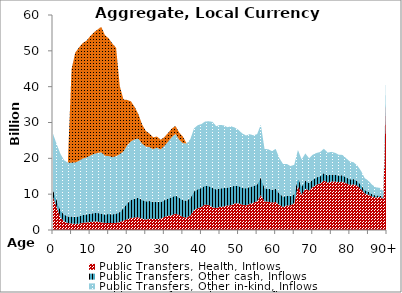
| Category | Public Transfers, Health, Inflows | Public Transfers, Other cash, Inflows | Public Transfers, Other in-kind, Inflows | Public Transfers, Education, Inflows |
|---|---|---|---|---|
| 0 | 9147.146 | 1959.565 | 15764.592 | 0 |
|  | 6385.825 | 1941.535 | 15600.686 | 0 |
| 2 | 3504.201 | 1968.343 | 15796.994 | 0 |
| 3 | 2394.184 | 1897.292 | 15178.629 | 0 |
| 4 | 1921.406 | 1890.214 | 14998.769 | 0 |
| 5 | 1818.423 | 1922.738 | 15039.878 | 26108.986 |
| 6 | 1701.352 | 1977.274 | 15147.878 | 30673.679 |
| 7 | 1760.908 | 2069.683 | 15477.897 | 31628.158 |
| 8 | 2030.554 | 2155.576 | 15734.792 | 32236.941 |
| 9 | 2133.294 | 2226.036 | 15872.092 | 32582.905 |
| 10 | 2224.043 | 2312.11 | 16204.069 | 33305.029 |
| 11 | 2357.462 | 2367.471 | 16484.465 | 33922.675 |
| 12 | 2337.153 | 2408.302 | 16750.487 | 34438.612 |
| 13 | 2152.805 | 2446.356 | 17051.362 | 35030.481 |
| 14 | 1992.421 | 2318.454 | 16406.231 | 33653.698 |
| 15 | 1961.53 | 2527.52 | 16142.325 | 32859.396 |
| 16 | 1917.819 | 2440.296 | 15956.04 | 31710.072 |
| 17 | 2018.392 | 2556.961 | 16032.409 | 30269.003 |
| 18 | 2214.767 | 2802.642 | 16125.905 | 18957.695 |
| 19 | 2621.151 | 3487.059 | 15856.642 | 14451.734 |
| 20 | 3004.753 | 4463.872 | 16164.196 | 12654.962 |
| 21 | 3370.128 | 5045.592 | 16331.344 | 11163.282 |
| 22 | 3510.459 | 5251.228 | 16521.962 | 9063.144 |
| 23 | 3574.239 | 5426.676 | 16491.586 | 6858.791 |
| 24 | 3183.989 | 5204.189 | 15702.218 | 5398.61 |
| 25 | 2941.226 | 5088.006 | 15247.815 | 4382.19 |
| 26 | 3103.954 | 4968.694 | 15052.047 | 3792.853 |
| 27 | 3137.249 | 4755.839 | 14677.001 | 3288.954 |
| 28 | 3034.905 | 4829.78 | 15127.697 | 3095.996 |
| 29 | 3173.304 | 4621.444 | 14710.423 | 2706.31 |
| 30 | 3660.699 | 4653.288 | 15100.677 | 2494.143 |
| 31 | 3974.212 | 4800.829 | 15859.336 | 2439.397 |
| 32 | 4118.186 | 4999.615 | 16779.897 | 2419.143 |
| 33 | 4589.504 | 5098.385 | 17126.151 | 2232.89 |
| 34 | 4223.803 | 4780.784 | 16181.472 | 2007.238 |
| 35 | 3642.135 | 4704.87 | 15898.448 | 1833.652 |
| 36 | 3467.297 | 4717.098 | 15957.611 | 0 |
| 37 | 4019.72 | 4880.913 | 16432.857 | 0 |
| 38 | 5585.049 | 5194.376 | 17577.441 | 0 |
| 39 | 6079.634 | 5297.263 | 17865.865 | 0 |
| 40 | 6463.335 | 5278.359 | 17824.646 | 0 |
| 41 | 7133.118 | 5269.762 | 17893.523 | 0 |
| 42 | 6932.978 | 5306.097 | 18087.923 | 0 |
| 43 | 6366.251 | 5390.064 | 18419.665 | 0 |
| 44 | 6119 | 5173.567 | 17678.571 | 0 |
| 45 | 6475.024 | 5169.19 | 17695.839 | 0 |
| 46 | 6540.479 | 5157.978 | 17497.58 | 0 |
| 47 | 6839.17 | 5009.226 | 16827.435 | 0 |
| 48 | 6920.545 | 5116.016 | 16906.628 | 0 |
| 49 | 7449.07 | 4943.725 | 16182.715 | 0 |
| 50 | 7429.079 | 4835.267 | 15659.416 | 0 |
| 51 | 7082.28 | 4709.399 | 15151.628 | 0 |
| 52 | 6888.909 | 4729.514 | 14766.607 | 0 |
| 53 | 7261.03 | 4759.501 | 14720.379 | 0 |
| 54 | 7637.486 | 4621.09 | 14160.549 | 0 |
| 55 | 8074.187 | 4644.673 | 14038.166 | 0 |
| 56 | 9748.472 | 4929.85 | 14715.94 | 0 |
| 57 | 7975.849 | 3668.906 | 10993.528 | 0 |
| 58 | 7914.558 | 3652.646 | 10953.662 | 0 |
| 59 | 7654.565 | 3590.319 | 10780.832 | 0 |
| 60 | 7814.717 | 3675.202 | 11137.793 | 0 |
| 61 | 7034.686 | 3185.164 | 9828.195 | 0 |
| 62 | 6407.122 | 2883.383 | 9117.535 | 0 |
| 63 | 6842.409 | 2739.231 | 8858.587 | 0 |
| 64 | 6891.152 | 2549.881 | 8414.895 | 0 |
| 65 | 7502.165 | 2459.937 | 8241.427 | 0 |
| 66 | 12274.344 | 2308.355 | 7751.999 | 0 |
| 67 | 9841.622 | 2268.775 | 7593.575 | 0 |
| 68 | 11522.066 | 2260.627 | 7582.192 | 0 |
| 69 | 11029.981 | 2067.658 | 6937.069 | 0 |
| 70 | 12003.058 | 2083.801 | 6924.576 | 0 |
| 71 | 12624.013 | 2052.995 | 6823.204 | 0 |
| 72 | 13003.178 | 2035.379 | 6733.113 | 0 |
| 73 | 13811.282 | 2080.937 | 6792.672 | 0 |
| 74 | 13228.086 | 1982.592 | 6379.499 | 0 |
| 75 | 13520.823 | 1977.324 | 6309.594 | 0 |
| 76 | 13530.164 | 1925.295 | 6090.262 | 0 |
| 77 | 13378.902 | 1833.489 | 5796.587 | 0 |
| 78 | 13491.696 | 1789.091 | 5674.173 | 0 |
| 79 | 13033.861 | 1648.913 | 5332.271 | 0 |
| 80 | 12615.208 | 1571.344 | 4940.07 | 0 |
| 81 | 12712.251 | 1488.115 | 4680.098 | 0 |
| 82 | 12367.518 | 1328.965 | 4313.076 | 0 |
| 83 | 11380.905 | 1167.696 | 3941.608 | 0 |
| 84 | 10226.632 | 948.818 | 3308.286 | 0 |
| 85 | 9858.907 | 825.325 | 3074.662 | 0 |
| 86 | 9334.004 | 658.161 | 2627.392 | 0 |
| 87 | 9046.726 | 548.367 | 2318.235 | 0 |
| 88 | 9258.41 | 459.614 | 2057.618 | 0 |
| 89 | 8751.646 | 367.826 | 1750.842 | 0 |
| 90+ | 45355.433 | 1312.872 | 6612.541 | 0 |